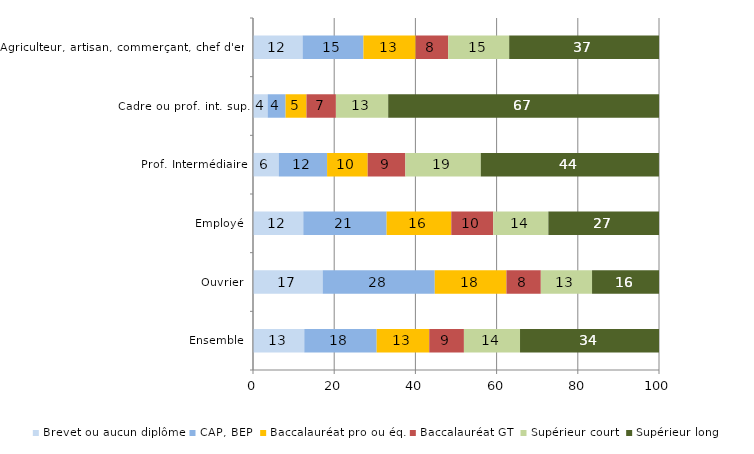
| Category | Brevet ou aucun diplôme | CAP, BEP | Baccalauréat pro ou éq. | Baccalauréat GT | Supérieur court | Supérieur long |
|---|---|---|---|---|---|---|
| Ensemble | 12.63 | 17.83 | 12.95 | 8.54 | 13.82 | 34.23 |
| Ouvrier | 17.16 | 27.61 | 17.65 | 8.47 | 12.62 | 16.49 |
| Employé | 12.39 | 20.52 | 15.93 | 10.33 | 13.58 | 27.25 |
| Prof. Intermédiaire | 6.35 | 11.9 | 10 | 9.28 | 18.58 | 43.88 |
| Cadre ou prof. int. sup. | 3.61 | 4.42 | 5.14 | 7.25 | 12.88 | 66.71 |
| Agriculteur, artisan, commerçant, chef d'ent. | 12.22 | 14.98 | 12.86 | 8.03 | 15.01 | 36.91 |